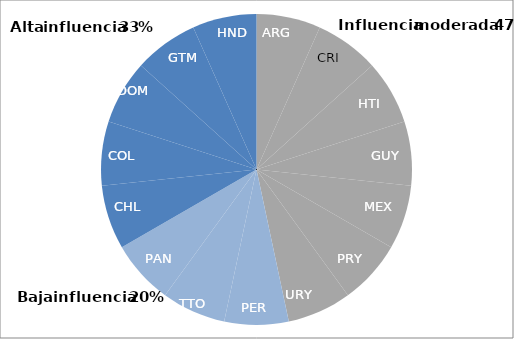
| Category | Level of influence of the CoG over line ministries to encourage coordination |
|---|---|
| ARG | 0.067 |
| CRI | 0.067 |
| HTI | 0.067 |
| GUY | 0.067 |
| MEX | 0.067 |
| PRY | 0.067 |
| URY | 0.067 |
| PER | 0.067 |
| TTO | 0.067 |
| PAN | 0.067 |
| CHL | 0.067 |
| COL | 0.067 |
| DOM | 0.067 |
| GTM | 0.067 |
| HND | 0.067 |